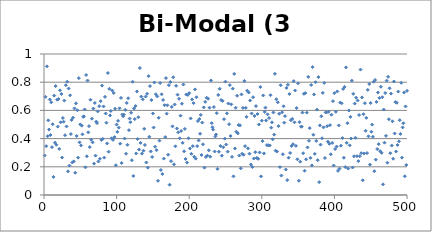
| Category | Bi-Modal (3 dice) |
|---|---|
| 0 | 0.28 |
| 1 | 0.696 |
| 2 | 0.346 |
| 3 | 0.912 |
| 4 | 0.417 |
| 5 | 0.529 |
| 6 | 0.464 |
| 7 | 0.677 |
| 8 | 0.426 |
| 9 | 0.658 |
| 10 | 0.339 |
| 11 | 0.502 |
| 12 | 0.128 |
| 13 | 0.705 |
| 14 | 0.371 |
| 15 | 0.772 |
| 16 | 0.356 |
| 17 | 0.676 |
| 18 | 0.485 |
| 19 | 0.681 |
| 20 | 0.327 |
| 21 | 0.743 |
| 22 | 0.516 |
| 23 | 0.716 |
| 24 | 0.266 |
| 25 | 0.546 |
| 26 | 0.52 |
| 27 | 0.67 |
| 28 | 0.424 |
| 29 | 0.778 |
| 30 | 0.486 |
| 31 | 0.803 |
| 32 | 0.168 |
| 33 | 0.755 |
| 34 | 0.208 |
| 35 | 0.707 |
| 36 | 0.432 |
| 37 | 0.532 |
| 38 | 0.231 |
| 39 | 0.549 |
| 40 | 0.238 |
| 41 | 0.614 |
| 42 | 0.158 |
| 43 | 0.65 |
| 44 | 0.419 |
| 45 | 0.601 |
| 46 | 0.265 |
| 47 | 0.829 |
| 48 | 0.373 |
| 49 | 0.501 |
| 50 | 0.352 |
| 51 | 0.492 |
| 52 | 0.43 |
| 53 | 0.554 |
| 54 | 0.558 |
| 55 | 0.607 |
| 56 | 0.196 |
| 57 | 0.851 |
| 58 | 0.274 |
| 59 | 0.812 |
| 60 | 0.445 |
| 61 | 0.488 |
| 62 | 0.34 |
| 63 | 0.676 |
| 64 | 0.392 |
| 65 | 0.541 |
| 66 | 0.373 |
| 67 | 0.613 |
| 68 | 0.222 |
| 69 | 0.653 |
| 70 | 0.279 |
| 71 | 0.52 |
| 72 | 0.51 |
| 73 | 0.593 |
| 74 | 0.238 |
| 75 | 0.63 |
| 76 | 0.257 |
| 77 | 0.665 |
| 78 | 0.39 |
| 79 | 0.776 |
| 80 | 0.398 |
| 81 | 0.628 |
| 82 | 0.265 |
| 83 | 0.696 |
| 84 | 0.578 |
| 85 | 0.513 |
| 86 | 0.366 |
| 87 | 0.865 |
| 88 | 0.307 |
| 89 | 0.753 |
| 90 | 0.565 |
| 91 | 0.596 |
| 92 | 0.402 |
| 93 | 0.741 |
| 94 | 0.391 |
| 95 | 0.723 |
| 96 | 0.411 |
| 97 | 0.612 |
| 98 | 0.211 |
| 99 | 0.499 |
| 100 | 0.447 |
| 101 | 0.526 |
| 102 | 0.478 |
| 103 | 0.615 |
| 104 | 0.364 |
| 105 | 0.688 |
| 106 | 0.227 |
| 107 | 0.571 |
| 108 | 0.559 |
| 109 | 0.57 |
| 110 | 0.4 |
| 111 | 0.604 |
| 112 | 0.293 |
| 113 | 0.653 |
| 114 | 0.356 |
| 115 | 0.686 |
| 116 | 0.46 |
| 117 | 0.542 |
| 118 | 0.516 |
| 119 | 0.584 |
| 120 | 0.247 |
| 121 | 0.803 |
| 122 | 0.135 |
| 123 | 0.613 |
| 124 | 0.538 |
| 125 | 0.631 |
| 126 | 0.295 |
| 127 | 0.734 |
| 128 | 0.397 |
| 129 | 0.551 |
| 130 | 0.323 |
| 131 | 0.9 |
| 132 | 0.37 |
| 133 | 0.698 |
| 134 | 0.293 |
| 135 | 0.678 |
| 136 | 0.314 |
| 137 | 0.469 |
| 138 | 0.355 |
| 139 | 0.698 |
| 140 | 0.231 |
| 141 | 0.718 |
| 142 | 0.194 |
| 143 | 0.843 |
| 144 | 0.413 |
| 145 | 0.772 |
| 146 | 0.309 |
| 147 | 0.673 |
| 148 | 0.27 |
| 149 | 0.578 |
| 150 | 0.479 |
| 151 | 0.798 |
| 152 | 0.343 |
| 153 | 0.714 |
| 154 | 0.318 |
| 155 | 0.699 |
| 156 | 0.101 |
| 157 | 0.548 |
| 158 | 0.385 |
| 159 | 0.794 |
| 160 | 0.177 |
| 161 | 0.714 |
| 162 | 0.149 |
| 163 | 0.674 |
| 164 | 0.258 |
| 165 | 0.637 |
| 166 | 0.411 |
| 167 | 0.829 |
| 168 | 0.577 |
| 169 | 0.636 |
| 170 | 0.286 |
| 171 | 0.779 |
| 172 | 0.073 |
| 173 | 0.801 |
| 174 | 0.24 |
| 175 | 0.624 |
| 176 | 0.487 |
| 177 | 0.835 |
| 178 | 0.218 |
| 179 | 0.642 |
| 180 | 0.345 |
| 181 | 0.774 |
| 182 | 0.472 |
| 183 | 0.712 |
| 184 | 0.445 |
| 185 | 0.683 |
| 186 | 0.402 |
| 187 | 0.563 |
| 188 | 0.454 |
| 189 | 0.648 |
| 190 | 0.37 |
| 191 | 0.784 |
| 192 | 0.31 |
| 193 | 0.469 |
| 194 | 0.256 |
| 195 | 0.713 |
| 196 | 0.229 |
| 197 | 0.71 |
| 198 | 0.402 |
| 199 | 0.723 |
| 200 | 0.33 |
| 201 | 0.543 |
| 202 | 0.292 |
| 203 | 0.678 |
| 204 | 0.347 |
| 205 | 0.652 |
| 206 | 0.272 |
| 207 | 0.749 |
| 208 | 0.258 |
| 209 | 0.694 |
| 210 | 0.347 |
| 211 | 0.524 |
| 212 | 0.387 |
| 213 | 0.539 |
| 214 | 0.434 |
| 215 | 0.568 |
| 216 | 0.284 |
| 217 | 0.513 |
| 218 | 0.36 |
| 219 | 0.621 |
| 220 | 0.194 |
| 221 | 0.661 |
| 222 | 0.27 |
| 223 | 0.69 |
| 224 | 0.28 |
| 225 | 0.683 |
| 226 | 0.317 |
| 227 | 0.619 |
| 228 | 0.272 |
| 229 | 0.812 |
| 230 | 0.509 |
| 231 | 0.48 |
| 232 | 0.464 |
| 233 | 0.624 |
| 234 | 0.308 |
| 235 | 0.415 |
| 236 | 0.429 |
| 237 | 0.581 |
| 238 | 0.185 |
| 239 | 0.709 |
| 240 | 0.307 |
| 241 | 0.753 |
| 242 | 0.348 |
| 243 | 0.673 |
| 244 | 0.279 |
| 245 | 0.668 |
| 246 | 0.338 |
| 247 | 0.538 |
| 248 | 0.4 |
| 249 | 0.804 |
| 250 | 0.358 |
| 251 | 0.579 |
| 252 | 0.307 |
| 253 | 0.649 |
| 254 | 0.502 |
| 255 | 0.779 |
| 256 | 0.418 |
| 257 | 0.643 |
| 258 | 0.271 |
| 259 | 0.754 |
| 260 | 0.132 |
| 261 | 0.859 |
| 262 | 0.33 |
| 263 | 0.619 |
| 264 | 0.449 |
| 265 | 0.704 |
| 266 | 0.437 |
| 267 | 0.496 |
| 268 | 0.28 |
| 269 | 0.494 |
| 270 | 0.189 |
| 271 | 0.713 |
| 272 | 0.293 |
| 273 | 0.618 |
| 274 | 0.286 |
| 275 | 0.809 |
| 276 | 0.347 |
| 277 | 0.618 |
| 278 | 0.554 |
| 279 | 0.74 |
| 280 | 0.331 |
| 281 | 0.727 |
| 282 | 0.293 |
| 283 | 0.67 |
| 284 | 0.217 |
| 285 | 0.578 |
| 286 | 0.198 |
| 287 | 0.694 |
| 288 | 0.259 |
| 289 | 0.561 |
| 290 | 0.304 |
| 291 | 0.631 |
| 292 | 0.263 |
| 293 | 0.574 |
| 294 | 0.256 |
| 295 | 0.5 |
| 296 | 0.302 |
| 297 | 0.766 |
| 298 | 0.132 |
| 299 | 0.527 |
| 300 | 0.382 |
| 301 | 0.706 |
| 302 | 0.295 |
| 303 | 0.589 |
| 304 | 0.62 |
| 305 | 0.529 |
| 306 | 0.354 |
| 307 | 0.572 |
| 308 | 0.353 |
| 309 | 0.546 |
| 310 | 0.352 |
| 311 | 0.708 |
| 312 | 0.477 |
| 313 | 0.515 |
| 314 | 0.395 |
| 315 | 0.585 |
| 316 | 0.428 |
| 317 | 0.86 |
| 318 | 0.314 |
| 319 | 0.679 |
| 320 | 0.309 |
| 321 | 0.658 |
| 322 | 0.488 |
| 323 | 0.576 |
| 324 | 0.198 |
| 325 | 0.778 |
| 326 | 0.138 |
| 327 | 0.586 |
| 328 | 0.289 |
| 329 | 0.629 |
| 330 | 0.513 |
| 331 | 0.559 |
| 332 | 0.181 |
| 333 | 0.759 |
| 334 | 0.106 |
| 335 | 0.781 |
| 336 | 0.265 |
| 337 | 0.716 |
| 338 | 0.298 |
| 339 | 0.531 |
| 340 | 0.348 |
| 341 | 0.54 |
| 342 | 0.36 |
| 343 | 0.808 |
| 344 | 0.516 |
| 345 | 0.741 |
| 346 | 0.349 |
| 347 | 0.616 |
| 348 | 0.253 |
| 349 | 0.792 |
| 350 | 0.101 |
| 351 | 0.517 |
| 352 | 0.236 |
| 353 | 0.484 |
| 354 | 0.485 |
| 355 | 0.585 |
| 356 | 0.296 |
| 357 | 0.717 |
| 358 | 0.172 |
| 359 | 0.723 |
| 360 | 0.253 |
| 361 | 0.584 |
| 362 | 0.338 |
| 363 | 0.838 |
| 364 | 0.385 |
| 365 | 0.474 |
| 366 | 0.264 |
| 367 | 0.78 |
| 368 | 0.21 |
| 369 | 0.907 |
| 370 | 0.427 |
| 371 | 0.713 |
| 372 | 0.292 |
| 373 | 0.8 |
| 374 | 0.384 |
| 375 | 0.606 |
| 376 | 0.247 |
| 377 | 0.836 |
| 378 | 0.091 |
| 379 | 0.494 |
| 380 | 0.357 |
| 381 | 0.558 |
| 382 | 0.402 |
| 383 | 0.724 |
| 384 | 0.48 |
| 385 | 0.795 |
| 386 | 0.262 |
| 387 | 0.586 |
| 388 | 0.585 |
| 389 | 0.488 |
| 390 | 0.379 |
| 391 | 0.59 |
| 392 | 0.363 |
| 393 | 0.496 |
| 394 | 0.289 |
| 395 | 0.57 |
| 396 | 0.369 |
| 397 | 0.666 |
| 398 | 0.209 |
| 399 | 0.722 |
| 400 | 0.326 |
| 401 | 0.59 |
| 402 | 0.344 |
| 403 | 0.735 |
| 404 | 0.171 |
| 405 | 0.494 |
| 406 | 0.187 |
| 407 | 0.655 |
| 408 | 0.35 |
| 409 | 0.65 |
| 410 | 0.404 |
| 411 | 0.752 |
| 412 | 0.264 |
| 413 | 0.767 |
| 414 | 0.198 |
| 415 | 0.905 |
| 416 | 0.37 |
| 417 | 0.509 |
| 418 | 0.188 |
| 419 | 0.599 |
| 420 | 0.352 |
| 421 | 0.554 |
| 422 | 0.401 |
| 423 | 0.811 |
| 424 | 0.195 |
| 425 | 0.718 |
| 426 | 0.275 |
| 427 | 0.649 |
| 428 | 0.406 |
| 429 | 0.691 |
| 430 | 0.276 |
| 431 | 0.67 |
| 432 | 0.24 |
| 433 | 0.567 |
| 434 | 0.275 |
| 435 | 0.889 |
| 436 | 0.297 |
| 437 | 0.692 |
| 438 | 0.104 |
| 439 | 0.573 |
| 440 | 0.294 |
| 441 | 0.651 |
| 442 | 0.455 |
| 443 | 0.547 |
| 444 | 0.297 |
| 445 | 0.746 |
| 446 | 0.416 |
| 447 | 0.787 |
| 448 | 0.215 |
| 449 | 0.652 |
| 450 | 0.449 |
| 451 | 0.499 |
| 452 | 0.412 |
| 453 | 0.803 |
| 454 | 0.169 |
| 455 | 0.816 |
| 456 | 0.251 |
| 457 | 0.66 |
| 458 | 0.326 |
| 459 | 0.727 |
| 460 | 0.361 |
| 461 | 0.689 |
| 462 | 0.311 |
| 463 | 0.768 |
| 464 | 0.299 |
| 465 | 0.693 |
| 466 | 0.076 |
| 467 | 0.606 |
| 468 | 0.371 |
| 469 | 0.723 |
| 470 | 0.42 |
| 471 | 0.811 |
| 472 | 0.229 |
| 473 | 0.838 |
| 474 | 0.537 |
| 475 | 0.757 |
| 476 | 0.296 |
| 477 | 0.719 |
| 478 | 0.351 |
| 479 | 0.523 |
| 480 | 0.257 |
| 481 | 0.805 |
| 482 | 0.436 |
| 483 | 0.659 |
| 484 | 0.308 |
| 485 | 0.654 |
| 486 | 0.355 |
| 487 | 0.734 |
| 488 | 0.381 |
| 489 | 0.53 |
| 490 | 0.433 |
| 491 | 0.796 |
| 492 | 0.265 |
| 493 | 0.479 |
| 494 | 0.509 |
| 495 | 0.727 |
| 496 | 0.133 |
| 497 | 0.628 |
| 498 | 0.213 |
| 499 | 0.739 |